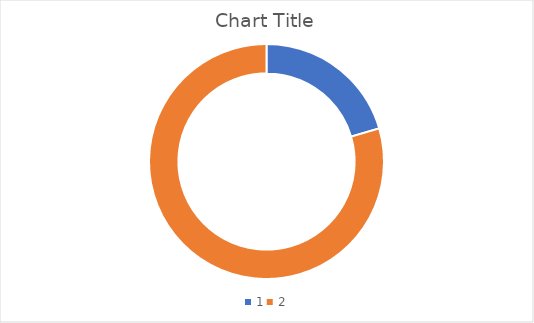
| Category | Series 0 |
|---|---|
| 0 | 305 |
| 1 | 1186.56 |